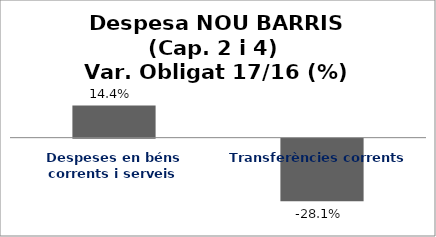
| Category | Series 0 |
|---|---|
| Despeses en béns corrents i serveis | 0.144 |
| Transferències corrents | -0.281 |